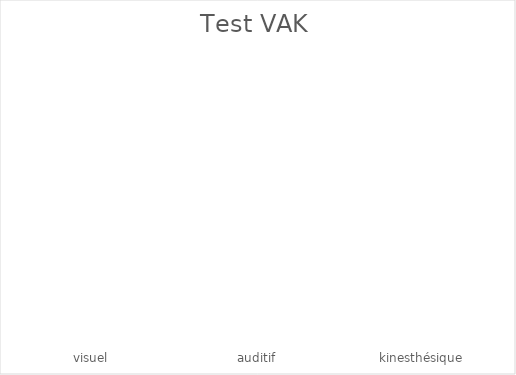
| Category | Series 0 |
|---|---|
| visuel | 0 |
| auditif | 0 |
| kinesthésique | 0 |